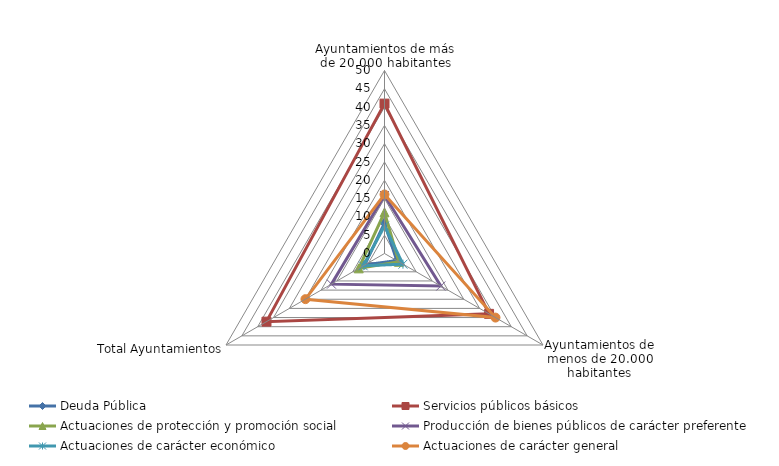
| Category | Deuda Pública | Servicios públicos básicos | Actuaciones de protección y promoción social | Producción de bienes públicos de carácter preferente | Actuaciones de carácter económico | Actuaciones de carácter general |
|---|---|---|---|---|---|---|
| Ayuntamientos de más de 20.000 habitantes | 8.311 | 40.953 | 11.257 | 15.843 | 7.501 | 16.136 |
| Ayuntamientos de menos de 20.000 habitantes | 3.867 | 32.986 | 4.537 | 17.767 | 5.825 | 35.019 |
| Total Ayuntamientos | 6.238 | 37.237 | 8.122 | 16.74 | 6.72 | 24.943 |